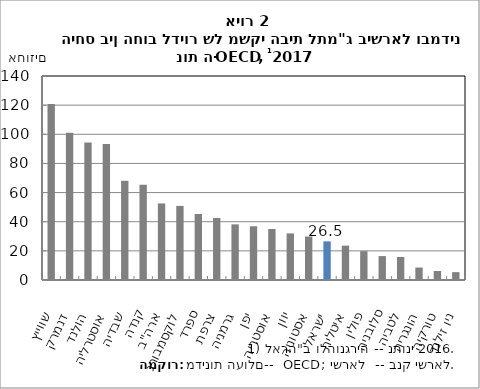
| Category | 2017 |
|---|---|
| שווייץ | 120.758 |
| דנמרק | 101.047 |
| הולנד | 94.324 |
| אוסטרליה | 93.406 |
| שבדיה | 68.048 |
| קנדה | 65.361 |
| ארה"ב | 52.537 |
| לוקסמבורג | 50.835 |
| ספרד | 45.302 |
| צרפת | 42.571 |
| גרמניה | 38.176 |
| יפן | 36.866 |
| אוסטריה | 35.005 |
| יוון | 31.973 |
| אסטוניה | 29.84 |
| ישראל | 26.524 |
| איטליה | 23.569 |
| פולין | 19.807 |
| סלובניה | 16.414 |
| לטביה | 15.81 |
| הונגריה | 8.526 |
| טורקיה | 6.171 |
| ניו זילנד | 5.4 |